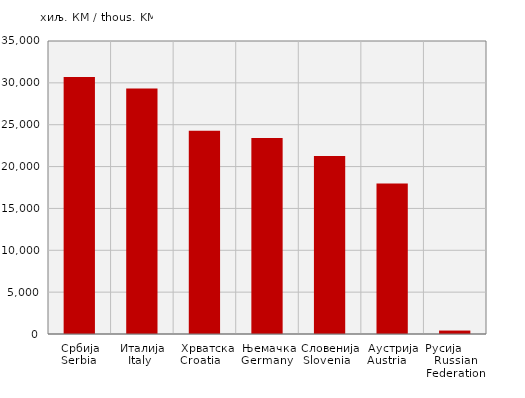
| Category | Извоз
Export |
|---|---|
| Србија
Serbia  | 30698 |
| Италија
Italy  | 29327 |
|  Хрватска
Croatia    | 24274 |
| Њемачка
Germany  | 23409 |
| Словенија
Slovenia   | 21255 |
| Аустрија
Austria     | 17992 |
| Русија        Russian Federation | 412 |